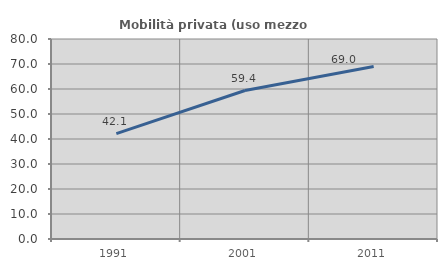
| Category | Mobilità privata (uso mezzo privato) |
|---|---|
| 1991.0 | 42.147 |
| 2001.0 | 59.382 |
| 2011.0 | 69.021 |